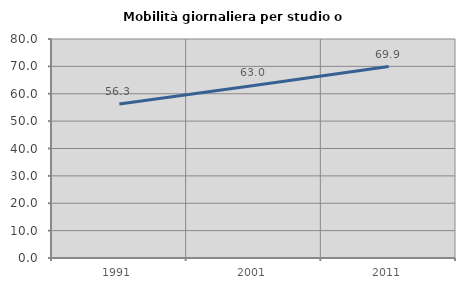
| Category | Mobilità giornaliera per studio o lavoro |
|---|---|
| 1991.0 | 56.277 |
| 2001.0 | 63.05 |
| 2011.0 | 69.922 |